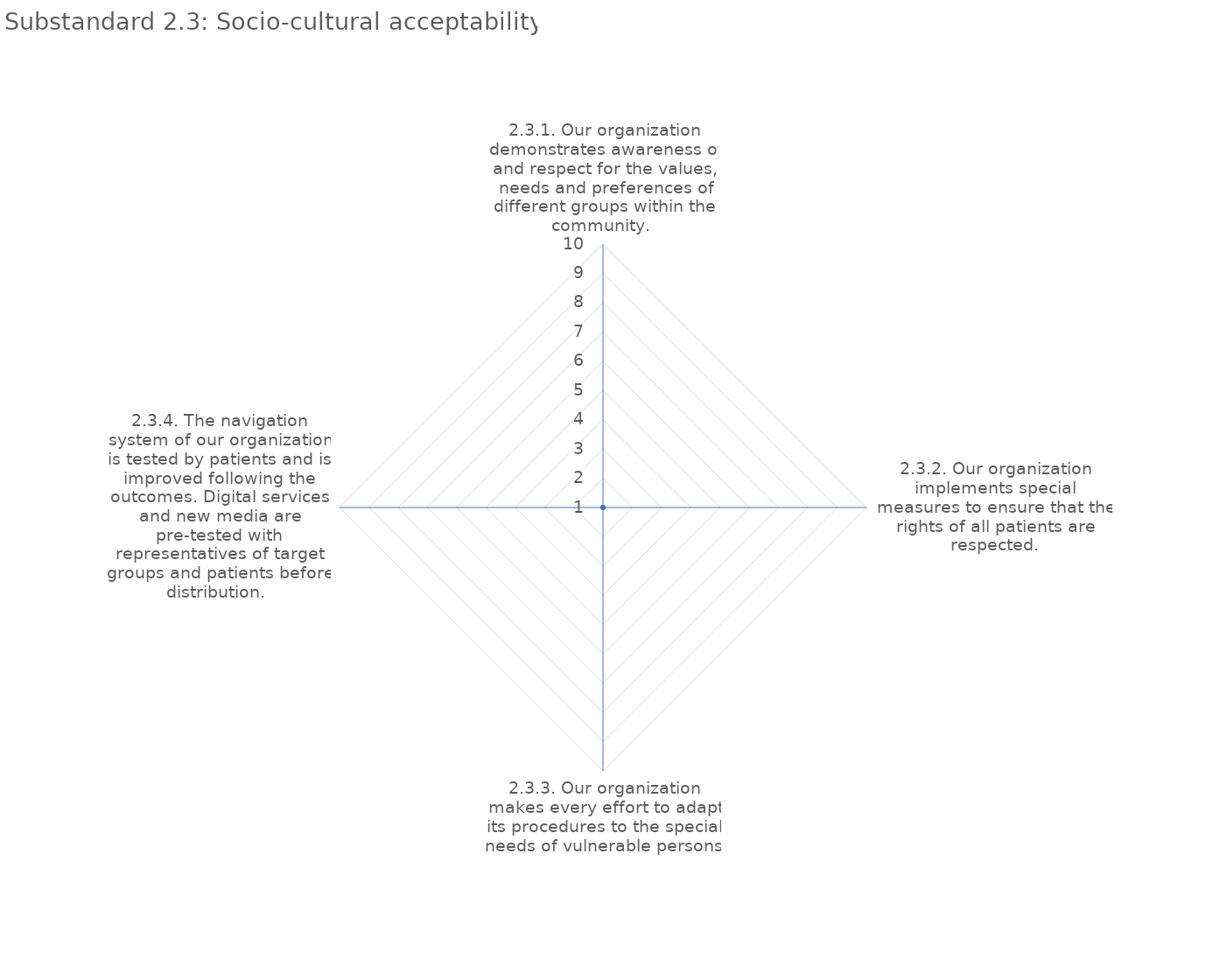
| Category | value |
|---|---|
| 2.3.1. Our organization demonstrates awareness of and respect for the values, needs and preferences of different groups within the community.  | 1 |
| 2.3.2. Our organization implements special measures to ensure that the rights of all patients are respected. | 1 |
| 2.3.3. Our organization makes every effort to adapt its procedures to the special needs of vulnerable persons.  | 1 |
| 2.3.4. The navigation system of our organization is tested by patients and is improved following the outcomes. Digital services and new media are pre-tested with representatives of target groups and patients before distribution.  | 1 |